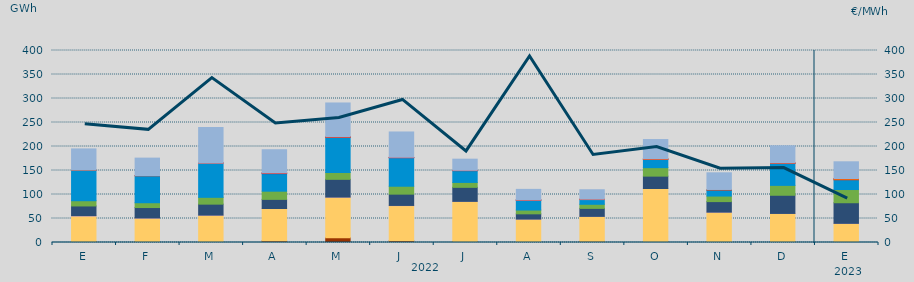
| Category | Carbón | Ciclo Combinado | Cogeneración | Consumo Bombeo | Eólica | Hidráulica | Nuclear | Otras Renovables | Solar fotovoltaica | Solar térmica | Turbinación bombeo |
|---|---|---|---|---|---|---|---|---|---|---|---|
| E | 1857.5 | 53248.9 | 859.7 | 20175.8 | 10885.7 | 63478.2 | 410.2 | 0 | 271.2 | 0 | 43785.9 |
| F | 1422.4 | 49296.1 | 416.6 | 21707.5 | 9996.4 | 56385.2 | 0 | 0 | 73.3 | 57.8 | 36436.3 |
| M | 696.5 | 56010.8 | 391.8 | 22798.3 | 14218 | 71626.6 | 0 | 7.4 | 87.7 | 6.7 | 73580.2 |
| A | 3349.534 | 67415.187 | 93.591 | 18989.102 | 17056.874 | 36445.011 | 1248.7 | 45.8 | 106.634 | 333.066 | 48166.851 |
| M | 10012.495 | 84316.131 | 342.191 | 36920.803 | 14355.123 | 73448.126 | 0.3 | 0 | 350.4 | 549.325 | 70399.534 |
| J | 3803.776 | 72994.164 | 408.816 | 23523.459 | 16484.811 | 59296.475 | 327.825 | 3.325 | 281.65 | 342.175 | 52808.788 |
| J | 2026.357 | 83630.229 | 62.5 | 29193.443 | 10247.658 | 24517.982 | 107.35 | 0 | 186.925 | 340.15 | 23284.195 |
| A | 608.425 | 48201.184 | 25.75 | 10881.743 | 7912.923 | 20661.25 | 49.5 | 8.225 | 251.425 | 88.725 | 21982.08 |
| S | 2432.475 | 52018.85 | 0.5 | 16627 | 8549.825 | 9810.3 | 0 | 23 | 777.175 | 6.75 | 19642.325 |
| O | 1876.1 | 110603.205 | 45 | 25745.4 | 17659.375 | 17006.05 | 12.825 | 16.6 | 1409.775 | 15.5 | 40055.836 |
| N | 1396.025 | 61724.955 | 198.008 | 21869.975 | 11579.495 | 12449.175 | 266.725 | 0 | 996.225 | 0 | 34713.224 |
| D | 1126.208 | 59335.684 | 104.85 | 37837.8 | 20596.98 | 45465.168 | 544.3 | 0 | 1011.875 | 1.5 | 35471.986 |
| E | 478.95 | 39423.05 | 26.617 | 42912.617 | 27499.217 | 20419.292 | 13.625 | 0 | 2540.742 | 1.5 | 34818.533 |